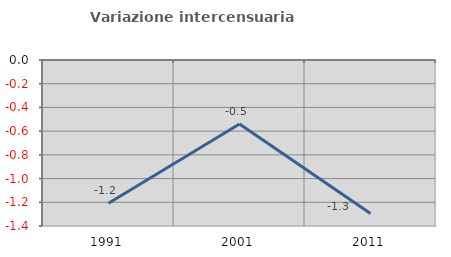
| Category | Variazione intercensuaria annua |
|---|---|
| 1991.0 | -1.209 |
| 2001.0 | -0.539 |
| 2011.0 | -1.295 |